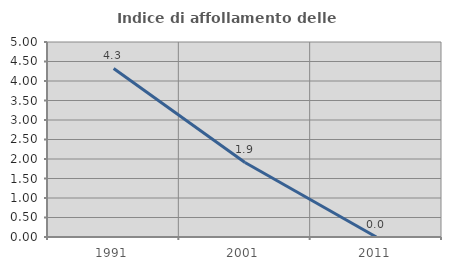
| Category | Indice di affollamento delle abitazioni  |
|---|---|
| 1991.0 | 4.321 |
| 2001.0 | 1.911 |
| 2011.0 | 0 |